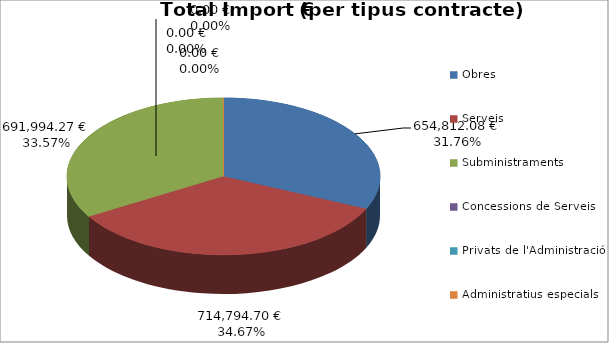
| Category | Total preu              (amb iva) |
|---|---|
| Obres | 654812.08 |
| Serveis | 714794.7 |
| Subministraments | 691994.27 |
| Concessions de Serveis | 0 |
| Privats de l'Administració | 0 |
| Administratius especials | 0 |